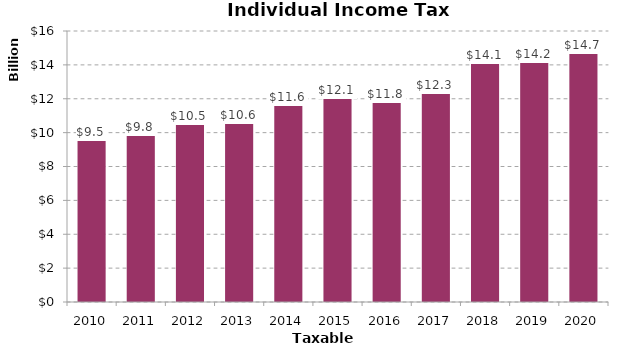
| Category | Amount |
|---|---|
| 2010.0 | 9537700528 |
| 2011.0 | 9846787045 |
| 2012.0 | 10527113882 |
| 2013.0 | 10586343685 |
| 2014.0 | 11623977320 |
| 2015.0 | 12071058964 |
| 2016.0 | 11800977144.56 |
| 2017.0 | 12342418241.27 |
| 2018.0 | 14112424787.53 |
| 2019.0 | 14172033140.65 |
| 2020.0 | 14728931857.1 |